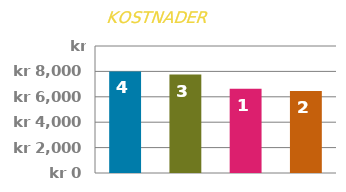
| Category | STARTKOSTNAD |
|---|---|
| 0 | 8000 |
| 1 | 7750 |
| 2 | 6625 |
| 3 | 6450 |